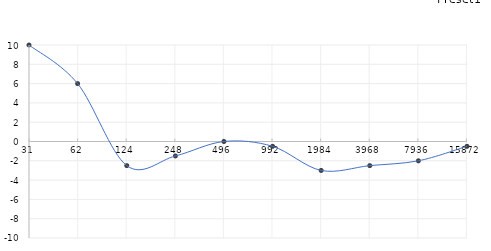
| Category | Series 0 |
|---|---|
| 31.0 | 10 |
| 62.0 | 6 |
| 125.0 | -2.5 |
| 250.0 | -1.5 |
| 500.0 | 0 |
| 1000.0 | -0.5 |
| 2000.0 | -3 |
| 4000.0 | -2.5 |
| 8000.0 | -2 |
| 16000.0 | -0.5 |